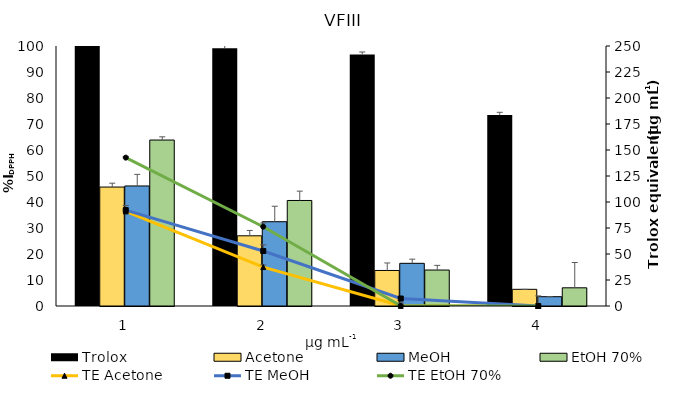
| Category | Trolox | Acetone | MeOH | EtOH 70% |
|---|---|---|---|---|
| 0 | 100 | 45.75 | 46.167 | 63.833 |
| 1 | 99.1 | 27 | 32.417 | 40.583 |
| 2 | 96.7 | 13.667 | 16.417 | 13.833 |
| 3 | 73.5 | 6.417 | 3.583 | 7 |